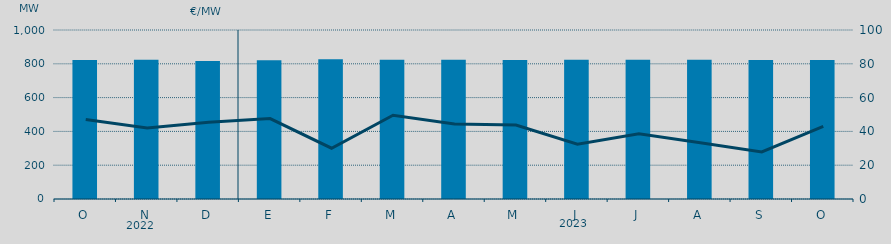
| Category | Potencia media a subir |
|---|---|
| O | 822.826 |
| N | 823.957 |
| D | 816.374 |
| E | 820.977 |
| F | 826.222 |
| M | 823.778 |
| A | 823.61 |
| M | 822.859 |
| J | 823.94 |
| J | 824.277 |
| A | 824.017 |
| S | 822.566 |
| O | 822.965 |